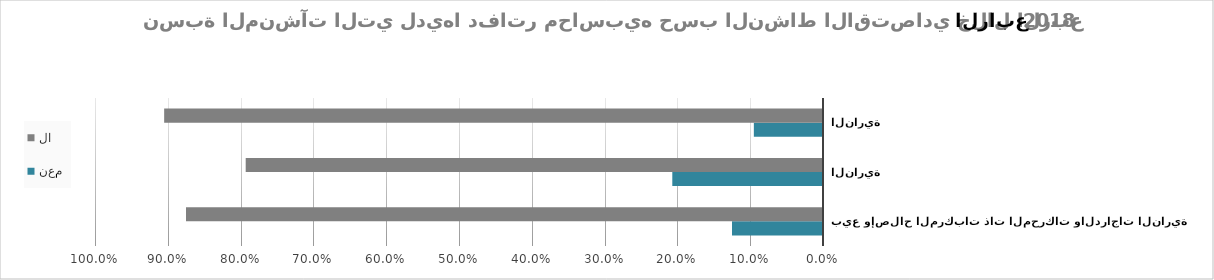
| Category | نعم | لا |
|---|---|---|
| بيع وإصلاح المركبات ذات المحركات والدراجات النارية | 0.125 | 0.875 |
| تجارة الجملة، باستثناء المركبات ذات المحركات والدراجات النارية | 0.207 | 0.793 |
| تجارة التجزئة، باستثناء المركبات ذات المحركات والدراجات النارية | 0.095 | 0.905 |